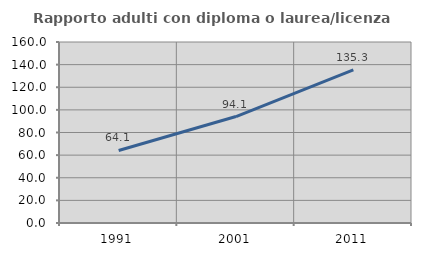
| Category | Rapporto adulti con diploma o laurea/licenza media  |
|---|---|
| 1991.0 | 64.129 |
| 2001.0 | 94.088 |
| 2011.0 | 135.337 |